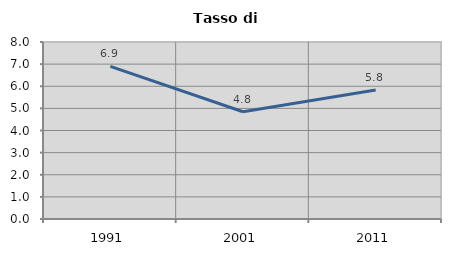
| Category | Tasso di disoccupazione   |
|---|---|
| 1991.0 | 6.897 |
| 2001.0 | 4.848 |
| 2011.0 | 5.829 |